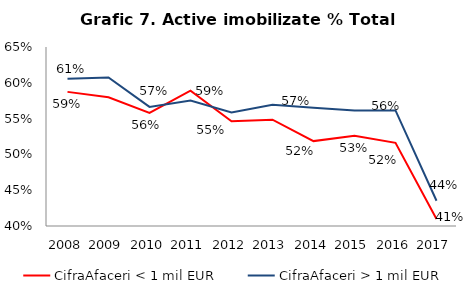
| Category | CifraAfaceri < 1 mil EUR | CifraAfaceri > 1 mil EUR |
|---|---|---|
| 2008.0 | 0.587 | 0.606 |
| 2009.0 | 0.58 | 0.607 |
| 2010.0 | 0.558 | 0.566 |
| 2011.0 | 0.589 | 0.575 |
| 2012.0 | 0.546 | 0.558 |
| 2013.0 | 0.549 | 0.569 |
| 2014.0 | 0.519 | 0.565 |
| 2015.0 | 0.526 | 0.561 |
| 2016.0 | 0.516 | 0.561 |
| 2017.0 | 0.41 | 0.435 |